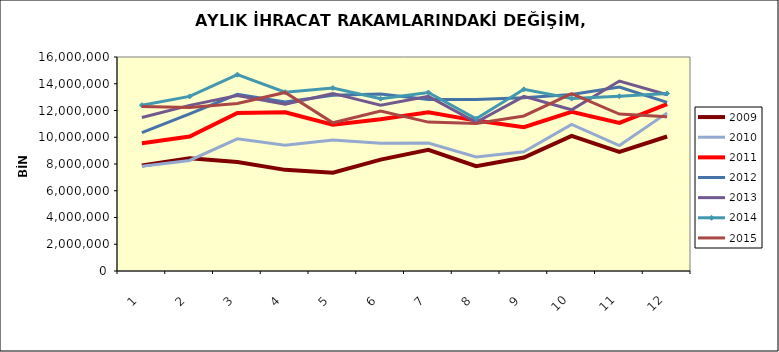
| Category | 2009 | 2010 | 2011 | 2012 | 2013 | 2014 | 2015 |
|---|---|---|---|---|---|---|---|
| 0 | 7884493.524 | 7828748.058 | 9551084.639 | 10348187.166 | 11481521.079 | 12399761.948 | 12302631.575 |
| 1 | 8435115.834 | 8263237.814 | 10059126.307 | 11748000.124 | 12385690.909 | 13053292.493 | 12232519.507 |
| 2 | 8155485.081 | 9886488.171 | 11811085.16 | 13208572.977 | 13122058.141 | 14680110.78 | 12522480.849 |
| 3 | 7561696.283 | 9396006.654 | 11873269.447 | 12630226.718 | 12468202.903 | 13371185.664 | 13350958.114 |
| 4 | 7346407.528 | 9799958.117 | 10943364.372 | 13131530.961 | 13277209.017 | 13681906.159 | 11081341.402 |
| 5 | 8329692.783 | 9542907.644 | 11349953.558 | 13231198.688 | 12399973.962 | 12880924.246 | 11954606.7 |
| 6 | 9055733.671 | 9564682.545 | 11860004.271 | 12830675.307 | 13059519.685 | 13344776.958 | 11132949.566 |
| 7 | 7839908.842 | 8523451.973 | 11245124.657 | 12831394.572 | 11118300.903 | 11386828.925 | 11028296.474 |
| 8 | 8480708.387 | 8909230.521 | 10750626.099 | 12952651.722 | 13060371.039 | 13583120.906 | 11590349.098 |
| 9 | 10095768.03 | 10963586.27 | 11907219.297 | 13190769.655 | 12053704.638 | 12891630.102 | 13260718.15 |
| 10 | 8903010.773 | 9382369.718 | 11078524.743 | 13753052.493 | 14201227.351 | 13067348.107 | 11737551.534 |
| 11 | 10054591.867 | 11822551.699 | 12477486.28 | 12605476.173 | 13174857.46 | 13269271.402 | 11535338.054 |